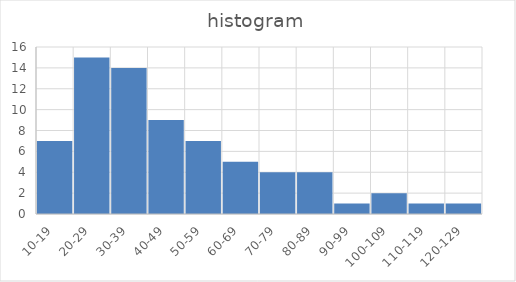
| Category | freq |
|---|---|
| 10-19 | 7 |
| 20-29 | 15 |
| 30-39 | 14 |
| 40-49 | 9 |
| 50-59 | 7 |
| 60-69 | 5 |
| 70-79 | 4 |
| 80-89 | 4 |
| 90-99 | 1 |
| 100-109 | 2 |
| 110-119 | 1 |
| 120-129 | 1 |